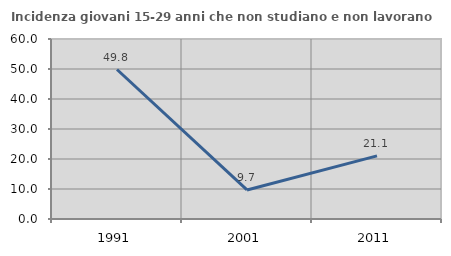
| Category | Incidenza giovani 15-29 anni che non studiano e non lavorano  |
|---|---|
| 1991.0 | 49.833 |
| 2001.0 | 9.677 |
| 2011.0 | 21.053 |